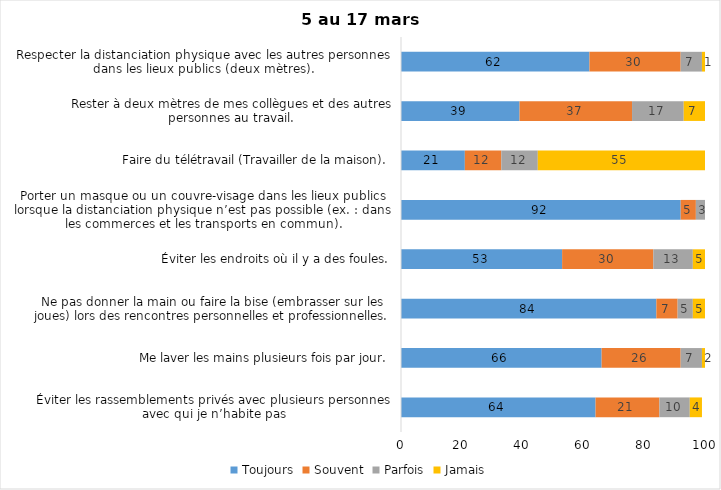
| Category | Toujours | Souvent | Parfois | Jamais |
|---|---|---|---|---|
| Éviter les rassemblements privés avec plusieurs personnes avec qui je n’habite pas | 64 | 21 | 10 | 4 |
| Me laver les mains plusieurs fois par jour. | 66 | 26 | 7 | 2 |
| Ne pas donner la main ou faire la bise (embrasser sur les joues) lors des rencontres personnelles et professionnelles. | 84 | 7 | 5 | 5 |
| Éviter les endroits où il y a des foules. | 53 | 30 | 13 | 5 |
| Porter un masque ou un couvre-visage dans les lieux publics lorsque la distanciation physique n’est pas possible (ex. : dans les commerces et les transports en commun). | 92 | 5 | 3 | 0 |
| Faire du télétravail (Travailler de la maison). | 21 | 12 | 12 | 55 |
| Rester à deux mètres de mes collègues et des autres personnes au travail. | 39 | 37 | 17 | 7 |
| Respecter la distanciation physique avec les autres personnes dans les lieux publics (deux mètres). | 62 | 30 | 7 | 1 |